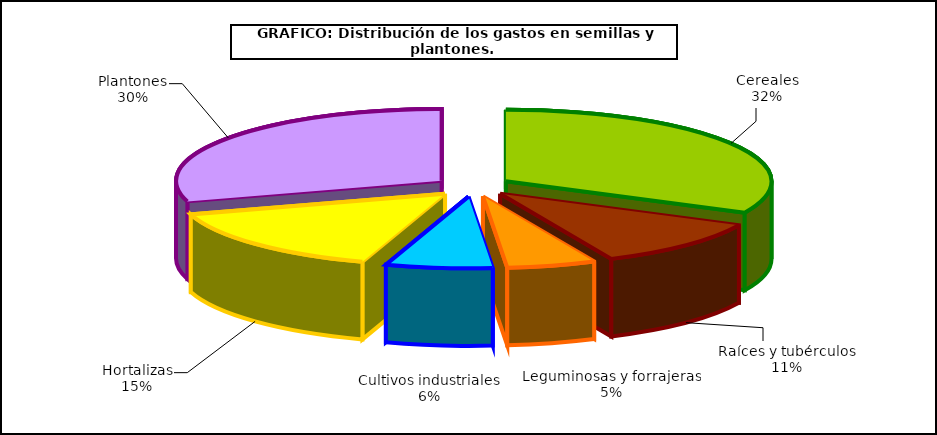
| Category | Series 0 |
|---|---|
| 0 | 297.853 |
| 1 | 100.939 |
| 2 | 50.085 |
| 3 | 60.036 |
| 4 | 141.395 |
| 5 | 274.412 |